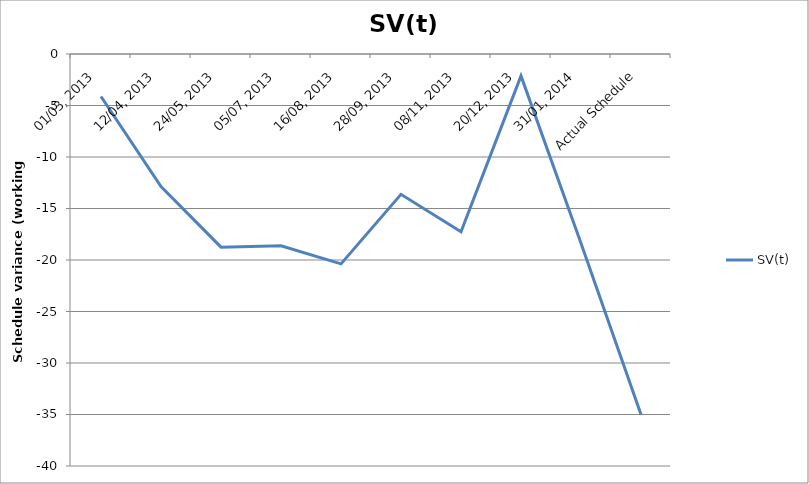
| Category | SV(t) |
|---|---|
| 01/03, 2013 | -4.125 |
| 12/04, 2013 | -12.875 |
| 24/05, 2013 | -18.75 |
| 05/07, 2013 | -18.625 |
| 16/08, 2013 | -20.375 |
| 28/09, 2013 | -13.625 |
| 08/11, 2013 | -17.25 |
| 20/12, 2013 | -2.125 |
| 31/01, 2014 | -18.375 |
| Actual Schedule | -35 |